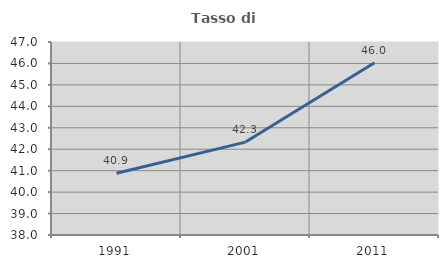
| Category | Tasso di occupazione   |
|---|---|
| 1991.0 | 40.881 |
| 2001.0 | 42.333 |
| 2011.0 | 46.034 |